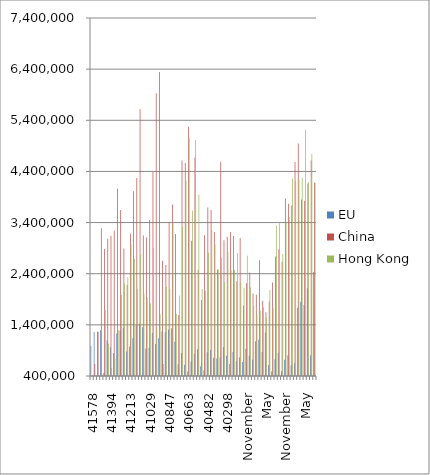
| Category | EU | China  | Hong Kong |
|---|---|---|---|
| 41,578 | 988554 | 106313 | 275518 |
| 41,547 | 1262479 | 633544 | 334723 |
| 41,517 | 1264391 | 1265582 | 381589 |
| 41,486 | 1293345 | 3287953 | 434266 |
| 41,455 | 462258 | 2884247 | 1688017 |
| 41,425 | 1097355 | 3085726 | 1033849 |
| 41,394 | 963074 | 3142682 | 556199 |
| 41,364 | 849037 | 3243096 | 749441 |
| 41,333 | 1229014 | 4064050 | 1297948 |
| 41,305 | 1287243 | 3647941 | 1982591 |
| 41,274 | 1340894 | 2894009 | 2203936 |
| 41,243 | 878121 | 2177635 | 2334073 |
| 41,213 | 978968 | 3181475 | 2970627 |
| 41,182 | 1142129 | 4014048 | 2696673 |
| 41,152 | 1386380 | 4269368 | 2104442 |
| 41,121 | 1420305 | 5620295 | 2779879 |
| 41,090 | 1353825 | 3149296 | 2015378 |
| 41,060 | 939522 | 3109175 | 1933848 |
| 41,029 | 953602 | 3448242 | 1816278 |
| 40,999 | 1239097 | 4391672 | 2895934 |
| 40,968 | 1025319 | 5929638 | 1351342 |
| 40,939 | 1140258 | 6344430 | 1608258 |
| 40,908 | 1276559 | 2653034 | 633214 |
| 40,877 | 1255646 | 2569600 | 2139988 |
| 40,847 | 1302431 | 3410082 | 2105304 |
| 40,816 | 1334879 | 3755361 | 3386008 |
| 40,786 | 1070021 | 3176303 | 1612815 |
| 40,755 | 627338 | 1592479 | 1972820 |
| 40,724 | 849274 | 4613602 | 3311453 |
| 40,694 | 621800 | 4567000 | 4218475 |
| 40,663 | 490170 | 5271468 | 5052695 |
| 40,633 | 684070 | 3043080 | 3634775 |
| 40,602 | 834174 | 4674766 | 5013354 |
| 40,574 | 923866 | 2475375 | 3949640 |
| 40,543 | 591382 | 1886738 | 2100771 |
| 40,512 | 511183 | 3154424 | 2068044 |
| 40,482 | 863054 | 3693630 | 2810962 |
| 40,451 | 909849 | 3648159 | 3253075 |
| 40,421 | 756546 | 3214266 | 2970776 |
| 40,390 | 742924 | 2480786 | 2483825 |
| 40,359 | 765717 | 4591371 | 2708485 |
| 40,329 | 968508 | 3053987 | 2232878 |
| 40,298 | 796552 | 3120408 | 2818536 |
| 40,268 | 632216 | 3217136 | 2466573 |
| 40,237 | 869338 | 3138522 | 2478301 |
| February | 687405 | 2254857 | 2807411 |
| January | 761327 | 3096551 | 2218525 |
| December | 673276 | 1778568 | 2122151 |
| November | 933853 | 2214451 | 2749080 |
| October | 794288 | 2421320 | 2135652 |
| September | 721815 | 2015475 | 1768508 |
| August | 1078746 | 1986808 | 1600727 |
| July | 1107172 | 2663010 | 1675725 |
| June | 868815 | 1871211 | 1736991 |
| May | 1251088 | 1646313 | 1540064 |
| April | 614054 | 1857366 | 2081069 |
| March | 487741 | 2229928 | 1726457 |
| February | 726591 | 2737475 | 3343226 |
| January | 852536 | 2876317 | 3386633 |
| December | 490488 | 2635826 | 2784997 |
| November | 715478 | 3869259 | 3395488 |
| October | 805002 | 3769098 | 3507374 |
| September | 616085 | 3732345 | 4262378 |
| August | 649301 | 4586758 | 4217195 |
| July | 1733655 | 4944944 | 4248217 |
| June | 1851760 | 3849784 | 4275651 |
| May | 1787823 | 3825786 | 5214645 |
| April | 2113637 | 4163316 | 4196897 |
| March | 801702 | 4611875 | 4741151 |
| February | 2431140 | 4185314 | 4175205 |